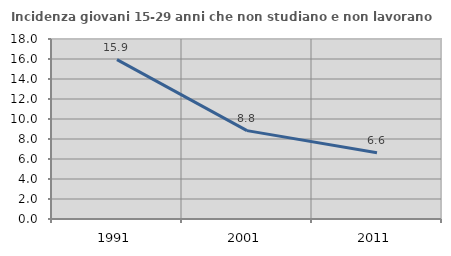
| Category | Incidenza giovani 15-29 anni che non studiano e non lavorano  |
|---|---|
| 1991.0 | 15.938 |
| 2001.0 | 8.839 |
| 2011.0 | 6.631 |